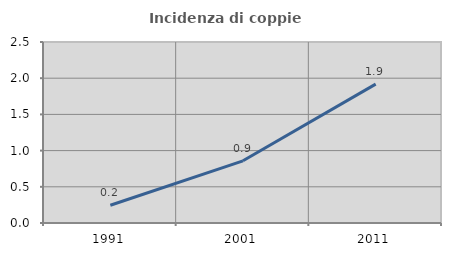
| Category | Incidenza di coppie miste |
|---|---|
| 1991.0 | 0.246 |
| 2001.0 | 0.859 |
| 2011.0 | 1.918 |